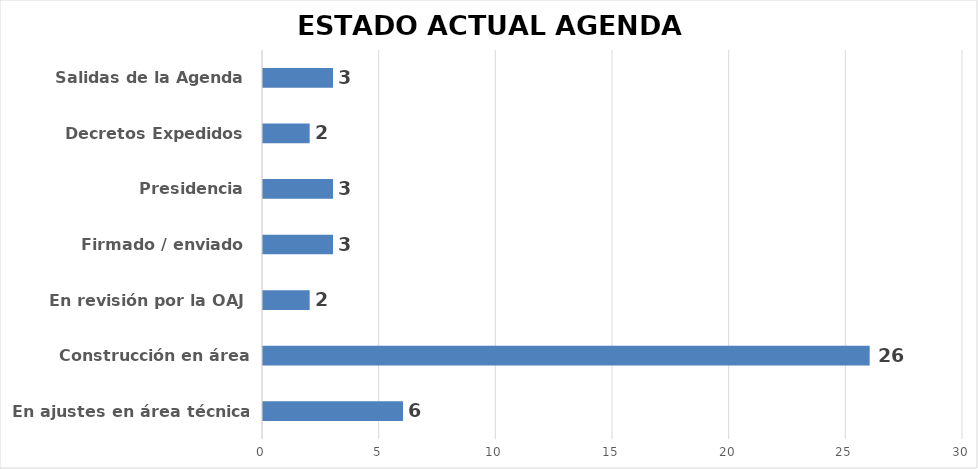
| Category | CANTIDAD |
|---|---|
| En ajustes en área técnica | 6 |
| Construcción en área técnica | 26 |
| En revisión por la OAJ | 2 |
| Firmado / enviado | 3 |
| Presidencia | 3 |
| Decretos Expedidos | 2 |
| Salidas de la Agenda | 3 |